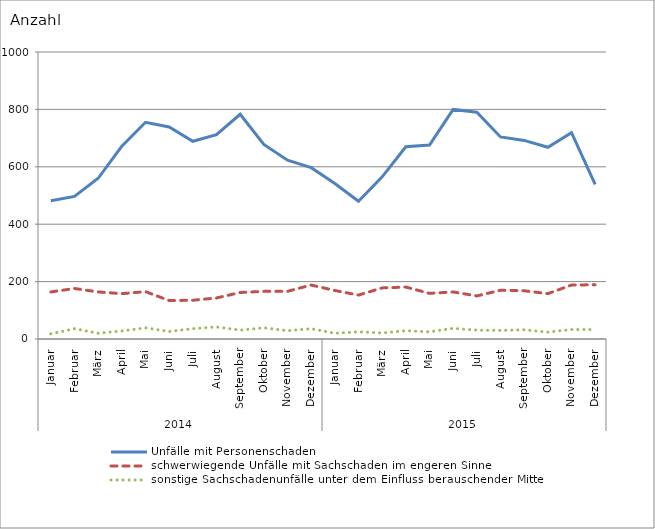
| Category | Unfälle mit Personenschaden | schwerwiegende Unfälle mit Sachschaden im engeren Sinne | sonstige Sachschadenunfälle unter dem Einfluss berauschender Mittel |
|---|---|---|---|
| 0 | 482 | 164 | 18 |
| 1 | 497 | 176 | 36 |
| 2 | 560 | 164 | 20 |
| 3 | 672 | 158 | 28 |
| 4 | 755 | 165 | 39 |
| 5 | 739 | 134 | 26 |
| 6 | 689 | 135 | 36 |
| 7 | 712 | 143 | 42 |
| 8 | 783 | 162 | 31 |
| 9 | 678 | 166 | 39 |
| 10 | 623 | 166 | 29 |
| 11 | 597 | 188 | 36 |
| 12 | 542 | 169 | 20 |
| 13 | 480 | 153 | 25 |
| 14 | 565 | 178 | 21 |
| 15 | 670 | 181 | 29 |
| 16 | 676 | 159 | 25 |
| 17 | 800 | 164 | 37 |
| 18 | 790 | 150 | 31 |
| 19 | 704 | 170 | 30 |
| 20 | 692 | 168 | 32 |
| 21 | 668 | 158 | 24 |
| 22 | 719 | 188 | 33 |
| 23 | 539 | 189 | 33 |